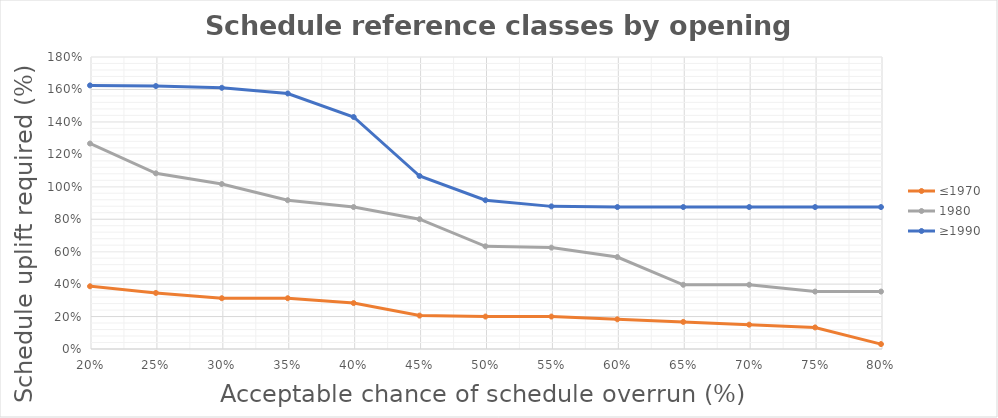
| Category | ≤1970 | 1980 | ≥1990 |
|---|---|---|---|
| 0.8 | 0.03 | 0.354 | 0.875 |
| 0.75 | 0.133 | 0.354 | 0.875 |
| 0.7 | 0.15 | 0.396 | 0.875 |
| 0.65 | 0.167 | 0.396 | 0.875 |
| 0.6 | 0.183 | 0.567 | 0.875 |
| 0.55 | 0.2 | 0.625 | 0.879 |
| 0.5 | 0.2 | 0.633 | 0.917 |
| 0.45 | 0.206 | 0.8 | 1.066 |
| 0.399999999999999 | 0.283 | 0.875 | 1.43 |
| 0.349999999999999 | 0.313 | 0.917 | 1.575 |
| 0.299999999999999 | 0.313 | 1.017 | 1.61 |
| 0.249999999999999 | 0.346 | 1.083 | 1.621 |
| 0.199999999999999 | 0.387 | 1.267 | 1.625 |